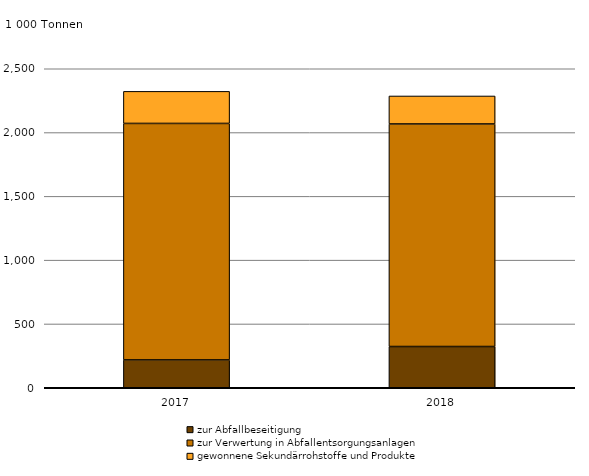
| Category | zur Abfallbeseitigung | zur Verwertung in Abfallentsorgungsanlagen | gewonnene Sekundärrohstoffe und Produkte |
|---|---|---|---|
| 2017.0 | 218209 | 1853284 | 251392 |
| 2018.0 | 323269 | 1743999 | 219457 |